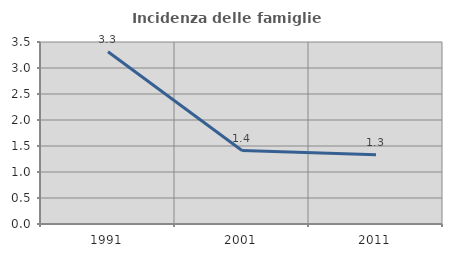
| Category | Incidenza delle famiglie numerose |
|---|---|
| 1991.0 | 3.312 |
| 2001.0 | 1.413 |
| 2011.0 | 1.333 |